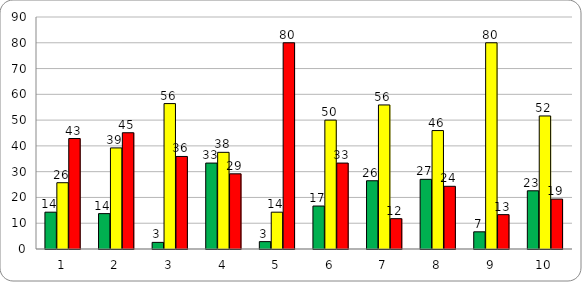
| Category | Series 0 | Series 1 | Series 2 |
|---|---|---|---|
| 0 | 14.286 | 25.714 | 42.857 |
| 1 | 13.725 | 39.216 | 45.098 |
| 2 | 2.564 | 56.41 | 35.897 |
| 3 | 33.333 | 37.5 | 29.167 |
| 4 | 2.857 | 14.286 | 80 |
| 5 | 16.667 | 50 | 33.333 |
| 6 | 26.471 | 55.882 | 11.765 |
| 7 | 27.027 | 45.946 | 24.324 |
| 8 | 6.667 | 80 | 13.333 |
| 9 | 22.581 | 51.613 | 19.355 |